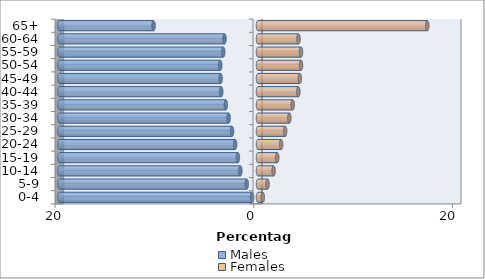
| Category | Males | Females |
|---|---|---|
| 0-4 | -0.594 | 0.479 |
| 5-9 | -1.134 | 0.962 |
| 10-14 | -1.777 | 1.568 |
| 15-19 | -2.024 | 1.933 |
| 20-24 | -2.303 | 2.327 |
| 25-29 | -2.617 | 2.732 |
| 30-34 | -2.96 | 3.153 |
| 35-39 | -3.242 | 3.499 |
| 40-44 | -3.702 | 4.063 |
| 45-49 | -3.76 | 4.212 |
| 50-54 | -3.799 | 4.334 |
| 55-59 | -3.501 | 4.326 |
| 60-64 | -3.37 | 4.076 |
| 65+ | -10.513 | 17.041 |